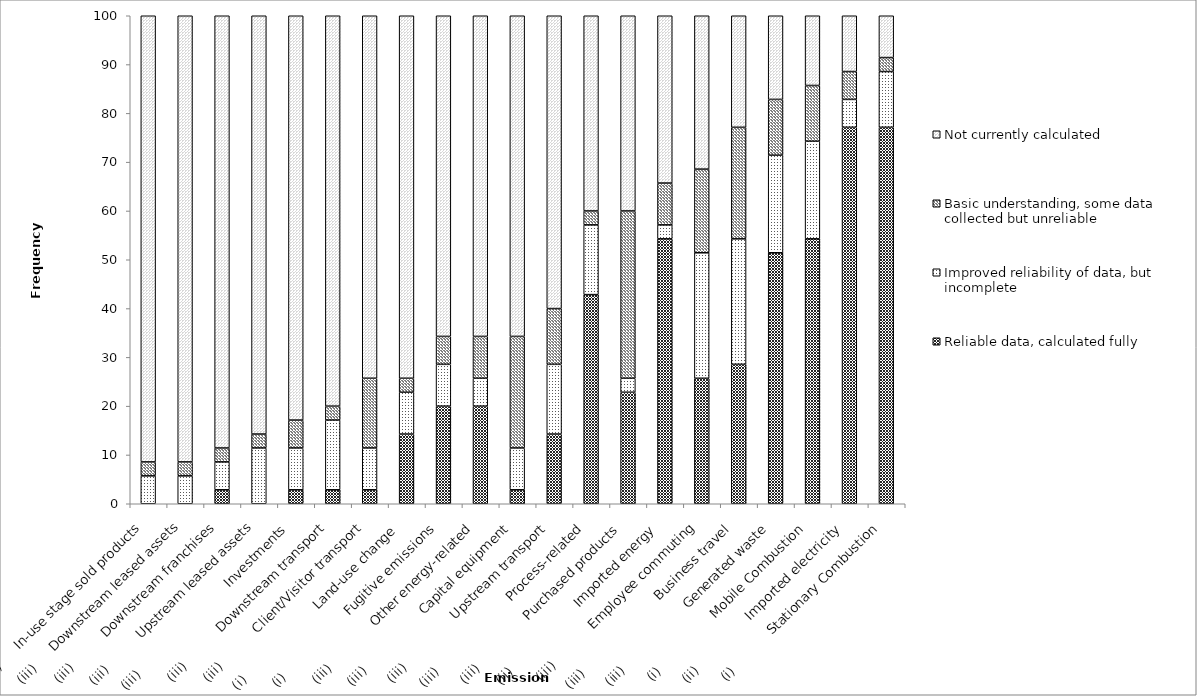
| Category | Reliable data, calculated fully | Improved reliability of data, but incomplete | Basic understanding, some data collected but unreliable | Not currently calculated |
|---|---|---|---|---|
| (iii)      In-use stage sold products | 0 | 5.714 | 2.857 | 91.429 |
| (iii)      Downstream leased assets | 0 | 5.714 | 2.857 | 91.429 |
| (iii)           Downstream franchises | 2.857 | 5.714 | 2.857 | 88.571 |
| (iii)           Upstream leased assets | 0 | 11.429 | 2.857 | 85.714 |
| (iii)                               Investments | 2.857 | 8.571 | 5.714 | 82.857 |
| (iii)            Downstream transport | 2.857 | 14.286 | 2.857 | 80 |
| (iii)            Client/Visitor transport | 2.857 | 8.571 | 14.286 | 74.286 |
| (i)                         Land-use change | 14.286 | 8.571 | 2.857 | 74.286 |
| (i)                      Fugitive emissions | 20 | 8.571 | 5.714 | 65.714 |
| (iii)               Other energy-related | 20 | 5.714 | 8.571 | 65.714 |
| (iii)                    Capital equipment | 2.857 | 8.571 | 22.857 | 65.714 |
| (iii)                 Upstream transport | 14.286 | 14.286 | 11.429 | 60 |
| (iii)                         Process-related | 42.857 | 14.286 | 2.857 | 40 |
| (iii)                 Purchased products | 22.857 | 2.857 | 34.286 | 40 |
| (ii)                       Imported energy | 54.286 | 2.857 | 8.571 | 34.286 |
| (iii)             Employee commuting | 25.714 | 25.714 | 17.143 | 31.429 |
| (iii)                          Business travel | 28.571 | 25.714 | 22.857 | 22.857 |
| (iii)                      Generated waste | 51.429 | 20 | 11.429 | 17.143 |
| (i)                   Mobile Combustion | 54.286 | 20 | 11.429 | 14.286 |
| (ii)                  Imported electricity | 77.143 | 5.714 | 5.714 | 11.429 |
| (i)             Stationary Combustion | 77.143 | 11.429 | 2.857 | 8.571 |